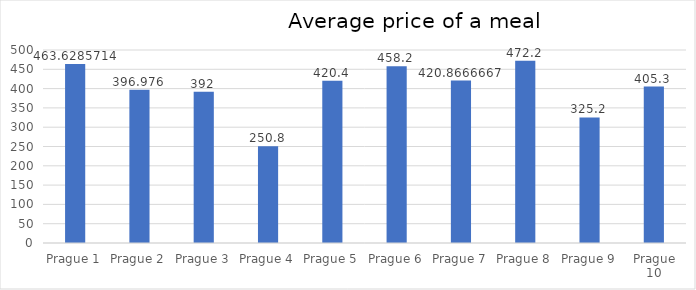
| Category | Series 0 |
|---|---|
| Prague 1 | 463.629 |
| Prague 2 | 396.976 |
| Prague 3 | 392 |
| Prague 4 | 250.8 |
| Prague 5 | 420.4 |
| Prague 6 | 458.2 |
| Prague 7 | 420.867 |
| Prague 8 | 472.2 |
| Prague 9 | 325.2 |
| Prague 10 | 405.3 |